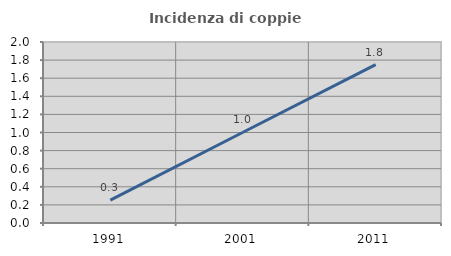
| Category | Incidenza di coppie miste |
|---|---|
| 1991.0 | 0.252 |
| 2001.0 | 1.003 |
| 2011.0 | 1.75 |